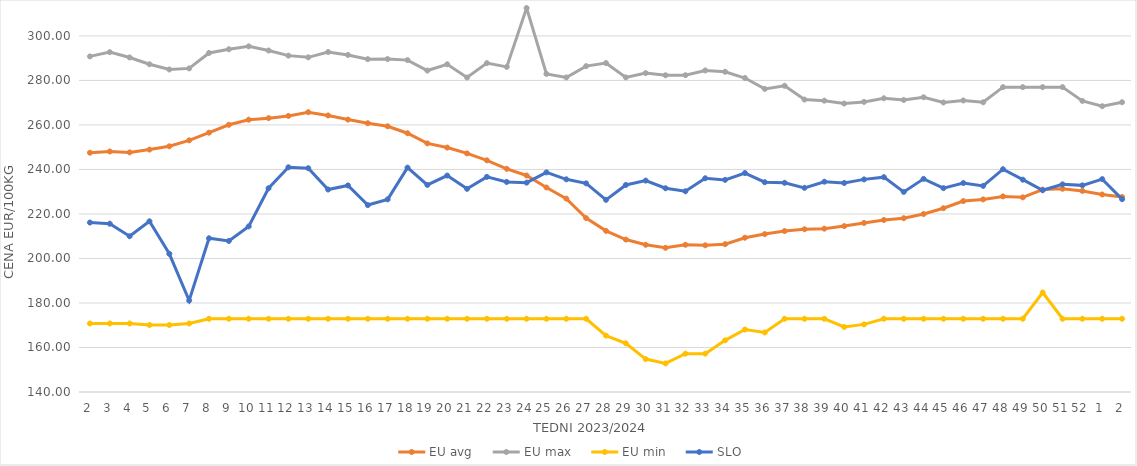
| Category | EU avg | EU max | EU min | SLO |
|---|---|---|---|---|
| 2.0 | 247.516 | 290.8 | 170.79 | 216.15 |
| 3.0 | 248.079 | 292.71 | 170.79 | 215.63 |
| 4.0 | 247.672 | 290.32 | 170.79 | 210 |
| 5.0 | 248.924 | 287.27 | 170.09 | 216.7 |
| 6.0 | 250.4 | 284.92 | 170.09 | 202.1 |
| 7.0 | 253.074 | 285.42 | 170.79 | 181.11 |
| 8.0 | 256.543 | 292.35 | 172.91 | 209.08 |
| 9.0 | 260.066 | 294.02 | 172.91 | 207.87 |
| 10.0 | 262.352 | 295.33 | 172.91 | 214.42 |
| 11.0 | 263.049 | 293.44 | 172.91 | 231.56 |
| 12.0 | 264.068 | 291.15 | 172.91 | 240.97 |
| 13.0 | 265.73 | 290.38 | 172.91 | 240.55 |
| 14.0 | 264.262 | 292.763 | 172.91 | 230.99 |
| 15.0 | 262.411 | 291.46 | 172.91 | 232.82 |
| 16.0 | 260.77 | 289.56 | 172.91 | 224 |
| 17.0 | 259.395 | 289.61 | 172.91 | 226.57 |
| 18.0 | 256.275 | 289.13 | 172.91 | 240.83 |
| 19.0 | 251.716 | 284.45 | 172.91 | 233.05 |
| 20.0 | 249.836 | 287.26 | 172.91 | 237.25 |
| 21.0 | 247.212 | 281.33 | 172.91 | 231.3 |
| 22.0 | 244.103 | 287.77 | 172.91 | 236.67 |
| 23.0 | 240.279 | 286.1 | 172.91 | 234.39 |
| 24.0 | 237.289 | 312.54 | 172.91 | 234.08 |
| 25.0 | 231.895 | 282.95 | 172.91 | 238.69 |
| 26.0 | 226.903 | 281.34 | 172.91 | 235.57 |
| 27.0 | 218.126 | 286.43 | 172.91 | 233.75 |
| 28.0 | 212.406 | 287.8 | 165.32 | 226.35 |
| 29.0 | 208.504 | 281.37 | 161.87 | 233.03 |
| 30.0 | 206.149 | 283.3 | 154.8 | 235 |
| 31.0 | 204.79 | 282.32 | 152.83 | 231.55 |
| 32.0 | 206.16 | 282.36 | 157.23 | 230.2 |
| 33.0 | 205.917 | 284.5 | 157.23 | 236.04 |
| 34.0 | 206.436 | 283.9 | 163.21 | 235.32 |
| 35.0 | 209.326 | 281.09 | 168.085 | 238.39 |
| 36.0 | 210.957 | 276.21 | 166.745 | 234.27 |
| 37.0 | 212.325 | 277.59 | 172.91 | 234 |
| 38.0 | 213.132 | 271.4 | 172.91 | 231.74 |
| 39.0 | 213.398 | 270.91 | 172.91 | 234.5 |
| 40.0 | 214.548 | 269.62 | 169.209 | 233.92 |
| 41.0 | 215.966 | 270.36 | 170.387 | 235.54 |
| 42.0 | 217.294 | 271.99 | 172.91 | 236.54 |
| 43.0 | 218.091 | 271.22 | 172.91 | 229.92 |
| 44.0 | 219.965 | 272.45 | 172.91 | 235.77 |
| 45.0 | 222.584 | 270.09 | 172.91 | 231.6 |
| 46.0 | 225.795 | 270.99 | 172.91 | 233.89 |
| 47.0 | 226.547 | 270.18 | 172.91 | 232.62 |
| 48.0 | 227.89 | 276.99 | 172.91 | 240.11 |
| 49.0 | 227.466 | 276.99 | 172.91 | 235.41 |
| 50.0 | 230.959 | 276.99 | 184.72 | 230.65 |
| 51.0 | 231.331 | 276.99 | 172.91 | 233.3 |
| 52.0 | 230.35 | 270.79 | 172.91 | 232.85 |
| 1.0 | 228.749 | 268.42 | 172.91 | 235.66 |
| 2.0 | 227.62 | 270.21 | 172.91 | 226.65 |